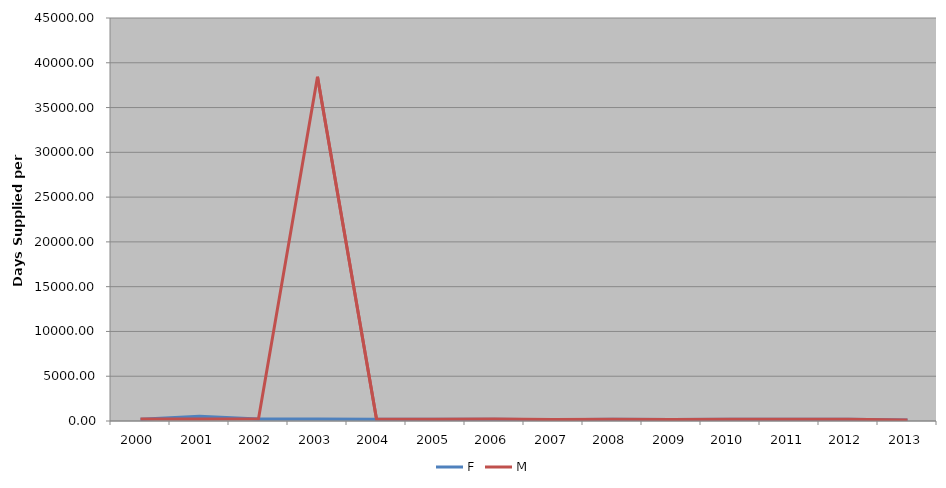
| Category | F | M |
|---|---|---|
| 2000 | 205.395 | 224.956 |
| 2001 | 521.413 | 233.399 |
| 2002 | 218.959 | 238.082 |
| 2003 | 220.306 | 38440.312 |
| 2004 | 205.515 | 220.935 |
| 2005 | 190.785 | 209.098 |
| 2006 | 196.87 | 210.664 |
| 2007 | 151.384 | 160.834 |
| 2008 | 186.348 | 187.13 |
| 2009 | 166.136 | 174.072 |
| 2010 | 184.744 | 187.9 |
| 2011 | 198.747 | 199.117 |
| 2012 | 208.739 | 208.616 |
| 2013 | 120.487 | 122.633 |